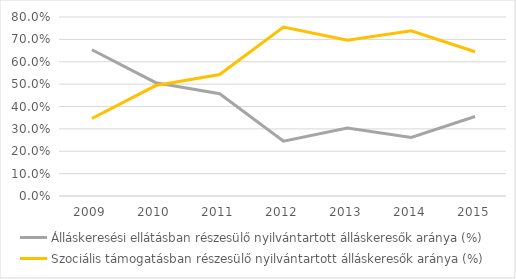
| Category | Álláskeresési ellátásban részesülő nyilvántartott álláskeresők aránya (%) | Szociális támogatásban részesülő nyilvántartott álláskeresők aránya (%) |
|---|---|---|
| 2009.0 | 0.654 | 0.346 |
| 2010.0 | 0.506 | 0.494 |
| 2011.0 | 0.457 | 0.543 |
| 2012.0 | 0.245 | 0.755 |
| 2013.0 | 0.303 | 0.697 |
| 2014.0 | 0.262 | 0.738 |
| 2015.0 | 0.355 | 0.645 |